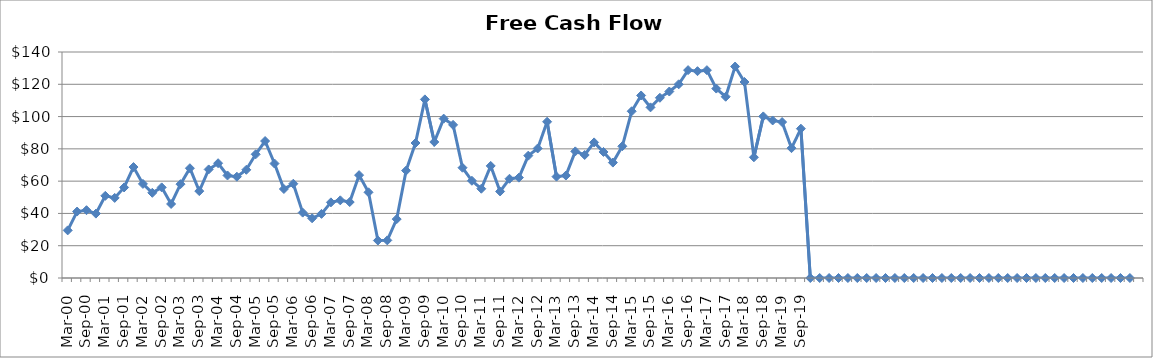
| Category | Series 0 |
|---|---|
| Mar-00 | 29.5 |
| Jun-00 | 41.169 |
| Sep-00 | 42.003 |
| Dec-00 | 39.882 |
| Mar-01 | 50.9 |
| Jun-01 | 49.611 |
| Sep-01 | 56.1 |
| Dec-01 | 68.736 |
| Mar-02 | 58.3 |
| Jun-02 | 52.775 |
| Sep-02 | 56.136 |
| Dec-02 | 45.868 |
| Mar-03 | 58.13 |
| Jun-03 | 68 |
| Sep-03 | 53.821 |
| Dec-03 | 67.256 |
| Mar-04 | 71.1 |
| Jun-04 | 63.511 |
| Sep-04 | 62.738 |
| Dec-04 | 67.028 |
| Mar-05 | 76.631 |
| Jun-05 | 84.846 |
| Sep-05 | 70.919 |
| Dec-05 | 55.133 |
| Mar-06 | 58.4 |
| Jun-06 | 40.501 |
| Sep-06 | 37 |
| Dec-06 | 39.718 |
| Mar-07 | 46.857 |
| Jun-07 | 48.123 |
| Sep-07 | 47.042 |
| Dec-07 | 63.716 |
| Mar-08 | 53.1 |
| Jun-08 | 23.212 |
| Sep-08 | 23.312 |
| Dec-08 | 36.49 |
| Mar-09 | 66.517 |
| Jun-09 | 83.62 |
| Sep-09 | 110.643 |
| Dec-09 | 84.264 |
| Mar-10 | 98.722 |
| Jun-10 | 94.858 |
| Sep-10 | 68.311 |
| Dec-10 | 60.237 |
| Mar-11 | 55.3 |
| Jun-11 | 69.436 |
| Sep-11 | 53.604 |
| Dec-11 | 61.477 |
| Mar-12 | 62.165 |
| Jun-12 | 75.78 |
| Sep-12 | 80.243 |
| Dec-12 | 96.781 |
| Mar-13 | 62.785 |
| Jun-13 | 63.472 |
| Sep-13 | 78.448 |
| Dec-13 | 76.2 |
| Mar-14 | 84 |
| Jun-14 | 78.064 |
| Sep-14 | 71.491 |
| Dec-14 | 81.6 |
| Mar-15 | 103.289 |
| Jun-15 | 113.067 |
| Sep-15 | 105.7 |
| Dec-15 | 111.635 |
| Mar-16 | 115.514 |
| Jun-16 | 119.985 |
| Sep-16 | 128.774 |
| Dec-16 | 128.118 |
| Mar-17 | 128.75 |
| Jun-17 | 117.35 |
| Sep-17 | 112.284 |
| Dec-17 | 130.994 |
| Mar-18 | 121.424 |
| Jun-18 | 74.776 |
| Sep-18 | 100.107 |
| Dec-18 | 97.585 |
| Mar-19 | 96.6 |
| Jun-19 | 80.429 |
| Sep-19 | 92.504 |